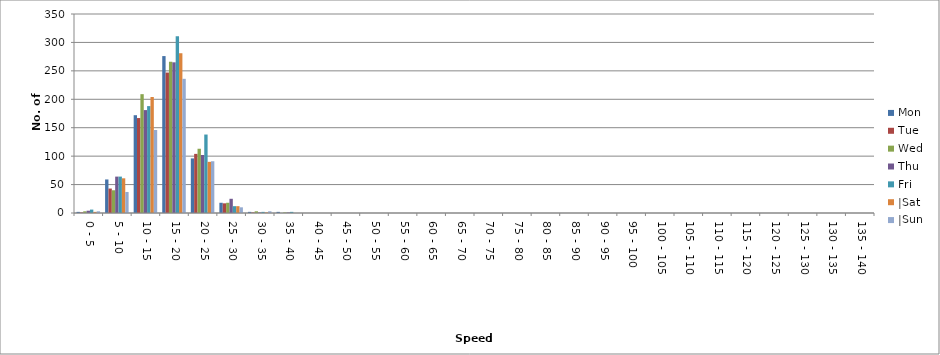
| Category | Mon | Tue | Wed | Thu | Fri | |Sat | |Sun |
|---|---|---|---|---|---|---|---|
| 0 - 5 | 2 | 1 | 3 | 4 | 6 | 2 | 3 |
| 5 - 10 | 59 | 43 | 40 | 64 | 64 | 61 | 37 |
| 10 - 15 | 172 | 167 | 209 | 181 | 188 | 204 | 146 |
| 15 - 20 | 276 | 247 | 266 | 265 | 311 | 281 | 236 |
| 20 - 25 | 96 | 104 | 113 | 102 | 138 | 90 | 91 |
| 25 - 30 | 18 | 17 | 18 | 25 | 12 | 12 | 10 |
| 30 - 35 | 2 | 1 | 3 | 1 | 2 | 1 | 3 |
| 35 - 40 | 2 | 0 | 1 | 1 | 2 | 0 | 0 |
| 40 - 45 | 0 | 0 | 0 | 0 | 0 | 0 | 0 |
| 45 - 50 | 0 | 0 | 0 | 0 | 0 | 0 | 0 |
| 50 - 55 | 0 | 0 | 0 | 0 | 0 | 0 | 0 |
| 55 - 60 | 0 | 0 | 0 | 0 | 0 | 0 | 0 |
| 60 - 65 | 0 | 0 | 0 | 0 | 0 | 0 | 0 |
| 65 - 70 | 0 | 0 | 0 | 0 | 0 | 0 | 0 |
| 70 - 75 | 0 | 0 | 0 | 0 | 0 | 0 | 0 |
| 75 - 80 | 0 | 0 | 0 | 0 | 0 | 0 | 0 |
| 80 - 85 | 0 | 0 | 0 | 0 | 0 | 0 | 0 |
| 85 - 90 | 0 | 0 | 0 | 0 | 0 | 0 | 0 |
| 90 - 95 | 0 | 0 | 0 | 0 | 0 | 0 | 0 |
| 95 - 100 | 0 | 0 | 0 | 0 | 0 | 0 | 0 |
| 100 - 105 | 0 | 0 | 0 | 0 | 0 | 0 | 0 |
| 105 - 110 | 0 | 0 | 0 | 0 | 0 | 0 | 0 |
| 110 - 115 | 0 | 0 | 0 | 0 | 0 | 0 | 0 |
| 115 - 120 | 0 | 0 | 0 | 0 | 0 | 0 | 0 |
| 120 - 125 | 0 | 0 | 0 | 0 | 0 | 0 | 0 |
| 125 - 130 | 0 | 0 | 0 | 0 | 0 | 0 | 0 |
| 130 - 135 | 0 | 0 | 0 | 0 | 0 | 0 | 0 |
| 135 - 140 | 0 | 0 | 0 | 0 | 0 | 0 | 0 |